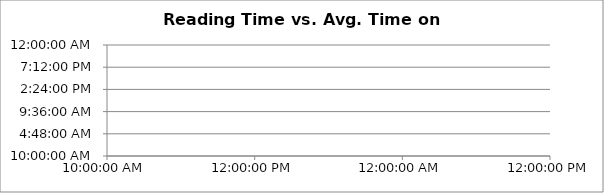
| Category | readers |
|---|---|
| 0 | 0 |
| 1 | 0 |
| 2 | 0 |
| 3 | 0 |
| 4 | 0 |
| 5 | 0 |
| 6 | 0 |
| 7 | 0 |
| 8 | 0 |
| 9 | 0 |
| 10 | 0 |
| 11 | 0 |
| 12 | 0 |
| 13 | 0 |
| 14 | 0 |
| 15 | 0 |
| 16 | 0 |
| 17 | 0 |
| 18 | 0 |
| 19 | 0 |
| 20 | 0 |
| 21 | 0 |
| 22 | 0 |